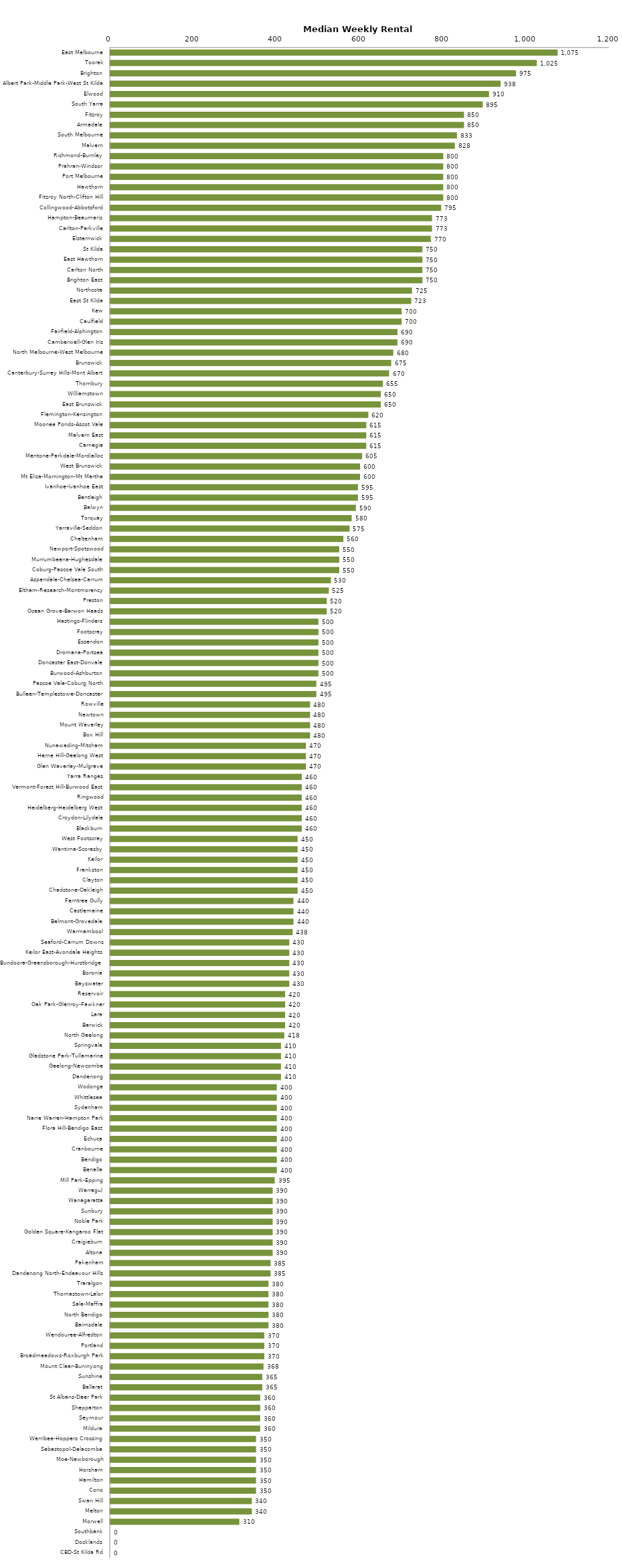
| Category | Series 0 |
|---|---|
| East Melbourne | 1075 |
| Toorak | 1025 |
| Brighton | 975 |
| Albert Park-Middle Park-West St Kilda | 938 |
| Elwood | 910 |
| South Yarra | 895 |
| Fitzroy | 850 |
| Armadale | 850 |
| South Melbourne | 833 |
| Malvern | 828 |
| Richmond-Burnley | 800 |
| Prahran-Windsor | 800 |
| Port Melbourne | 800 |
| Hawthorn | 800 |
| Fitzroy North-Clifton Hill | 800 |
| Collingwood-Abbotsford | 795 |
| Hampton-Beaumaris | 773 |
| Carlton-Parkville | 773 |
| Elsternwick | 770 |
| St Kilda | 750 |
| East Hawthorn | 750 |
| Carlton North | 750 |
| Brighton East | 750 |
| Northcote | 725 |
| East St Kilda | 723 |
| Kew | 700 |
| Caulfield | 700 |
| Fairfield-Alphington | 690 |
| Camberwell-Glen Iris | 690 |
| North Melbourne-West Melbourne | 680 |
| Brunswick | 675 |
| Canterbury-Surrey Hills-Mont Albert | 670 |
| Thornbury | 655 |
| Williamstown | 650 |
| East Brunswick | 650 |
| Flemington-Kensington | 620 |
| Moonee Ponds-Ascot Vale | 615 |
| Malvern East | 615 |
| Carnegie | 615 |
| Mentone-Parkdale-Mordialloc | 605 |
| West Brunswick | 600 |
| Mt Eliza-Mornington-Mt Martha | 600 |
| Ivanhoe-Ivanhoe East | 595 |
| Bentleigh | 595 |
| Balwyn | 590 |
| Torquay | 580 |
| Yarraville-Seddon | 575 |
| Cheltenham | 560 |
| Newport-Spotswood | 550 |
| Murrumbeena-Hughesdale | 550 |
| Coburg-Pascoe Vale South | 550 |
| Aspendale-Chelsea-Carrum | 530 |
| Eltham-Research-Montmorency | 525 |
| Preston | 520 |
| Ocean Grove-Barwon Heads | 520 |
| Hastings-Flinders | 500 |
| Footscray | 500 |
| Essendon | 500 |
| Dromana-Portsea | 500 |
| Doncaster East-Donvale | 500 |
| Burwood-Ashburton | 500 |
| Pascoe Vale-Coburg North | 495 |
| Bulleen-Templestowe-Doncaster | 495 |
| Rowville | 480 |
| Newtown | 480 |
| Mount Waverley | 480 |
| Box Hill | 480 |
| Nunawading-Mitcham | 470 |
| Herne Hill-Geelong West | 470 |
| Glen Waverley-Mulgrave | 470 |
| Yarra Ranges | 460 |
| Vermont-Forest Hill-Burwood East | 460 |
| Ringwood | 460 |
| Heidelberg-Heidelberg West | 460 |
| Croydon-Lilydale | 460 |
| Blackburn | 460 |
| West Footscray | 450 |
| Wantirna-Scoresby | 450 |
| Keilor | 450 |
| Frankston | 450 |
| Clayton | 450 |
| Chadstone-Oakleigh | 450 |
| Ferntree Gully | 440 |
| Castlemaine | 440 |
| Belmont-Grovedale | 440 |
| Warrnambool | 438 |
| Seaford-Carrum Downs | 430 |
| Keilor East-Avondale Heights | 430 |
| Bundoora-Greensborough-Hurstbridge | 430 |
| Boronia | 430 |
| Bayswater | 430 |
| Reservoir | 420 |
| Oak Park-Glenroy-Fawkner | 420 |
| Lara | 420 |
| Berwick | 420 |
| North Geelong | 418 |
| Springvale | 410 |
| Gladstone Park-Tullamarine | 410 |
| Geelong-Newcombe | 410 |
| Dandenong | 410 |
| Wodonga | 400 |
| Whittlesea | 400 |
| Sydenham | 400 |
| Narre Warren-Hampton Park | 400 |
| Flora Hill-Bendigo East | 400 |
| Echuca | 400 |
| Cranbourne | 400 |
| Bendigo | 400 |
| Benalla | 400 |
| Mill Park-Epping | 395 |
| Warragul | 390 |
| Wanagaratta | 390 |
| Sunbury | 390 |
| Noble Park | 390 |
| Golden Square-Kangaroo Flat | 390 |
| Craigieburn | 390 |
| Altona | 390 |
| Pakenham | 385 |
| Dandenong North-Endeavour Hills | 385 |
| Traralgon | 380 |
| Thomastown-Lalor | 380 |
| Sale-Maffra | 380 |
| North Bendigo | 380 |
| Bairnsdale | 380 |
| Wendouree-Alfredton | 370 |
| Portland | 370 |
| Broadmeadows-Roxburgh Park | 370 |
| Mount Clear-Buninyong | 368 |
| Sunshine | 365 |
| Ballarat | 365 |
| St Albans-Deer Park | 360 |
| Shepparton | 360 |
| Seymour | 360 |
| Mildura | 360 |
| Werribee-Hoppers Crossing | 350 |
| Sebastopol-Delacombe | 350 |
| Moe-Newborough | 350 |
| Horsham | 350 |
| Hamilton | 350 |
| Corio | 350 |
| Swan Hill | 340 |
| Melton | 340 |
| Morwell | 310 |
| Southbank | 0 |
| Docklands | 0 |
| CBD-St Kilda Rd | 0 |